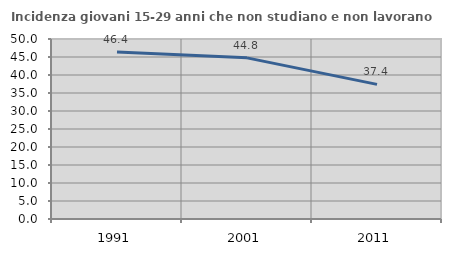
| Category | Incidenza giovani 15-29 anni che non studiano e non lavorano  |
|---|---|
| 1991.0 | 46.402 |
| 2001.0 | 44.763 |
| 2011.0 | 37.402 |